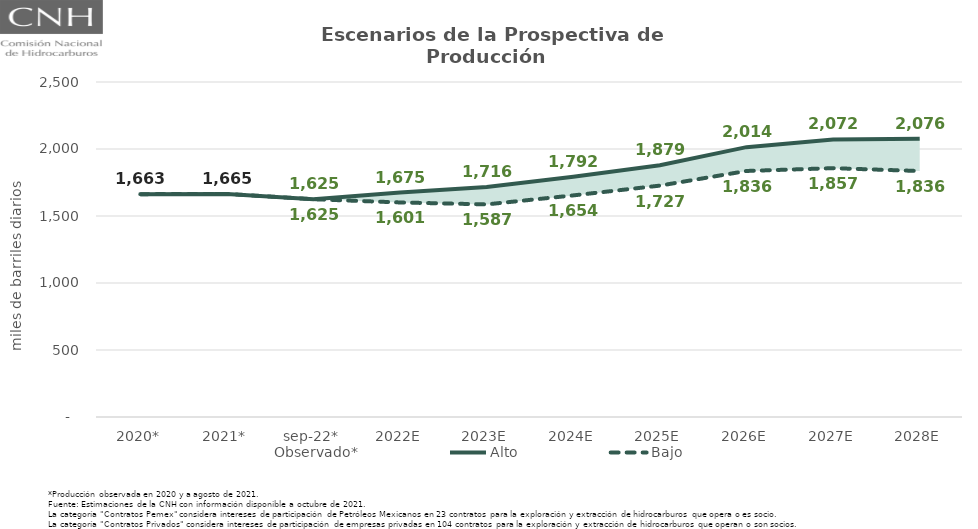
| Category | Observado* | Alto | Bajo |
|---|---|---|---|
| 2020* | 1663.067 | 1663.067 | 1663.067 |
| 2021* | 1664.715 | 1664.715 | 1664.715 |
| sep-22* | 1625.017 | 1625.017 | 1625.017 |
| 2022E | 1644.886 | 1675.365 | 1601.101 |
| 2023E | 1678.556 | 1716.232 | 1586.59 |
| 2024E | 1750.398 | 1792.31 | 1653.739 |
| 2025E | 1810.029 | 1879.227 | 1726.72 |
| 2026E | 1908.851 | 2013.86 | 1836.06 |
| 2027E | 1930.284 | 2071.645 | 1856.982 |
| 2028E | 1907.342 | 2075.945 | 1835.624 |